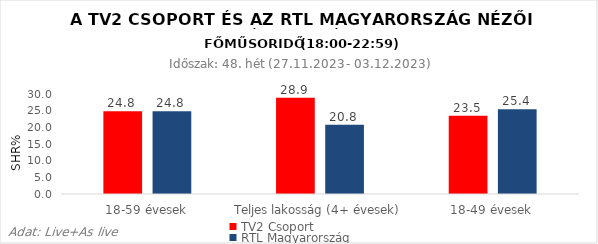
| Category | TV2 Csoport | RTL Magyarország |
|---|---|---|
| 18-59 évesek | 24.8 | 24.8 |
| Teljes lakosság (4+ évesek) | 28.9 | 20.8 |
| 18-49 évesek | 23.5 | 25.4 |